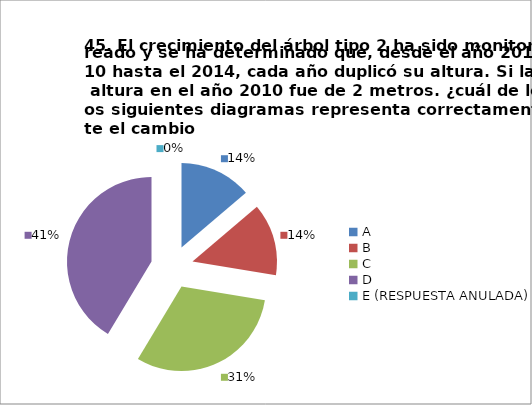
| Category | CANTIDAD DE RESPUESTAS PREGUNTA (45) | PORCENTAJE |
|---|---|---|
| A | 4 | 0.138 |
| B | 4 | 0.138 |
| C | 9 | 0.31 |
| D | 12 | 0.414 |
| E (RESPUESTA ANULADA) | 0 | 0 |